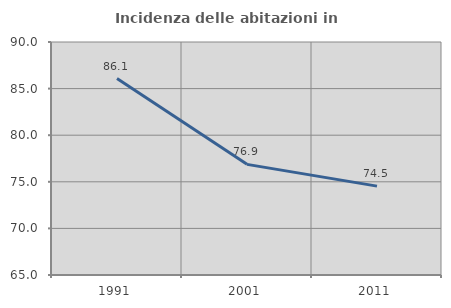
| Category | Incidenza delle abitazioni in proprietà  |
|---|---|
| 1991.0 | 86.076 |
| 2001.0 | 76.871 |
| 2011.0 | 74.534 |